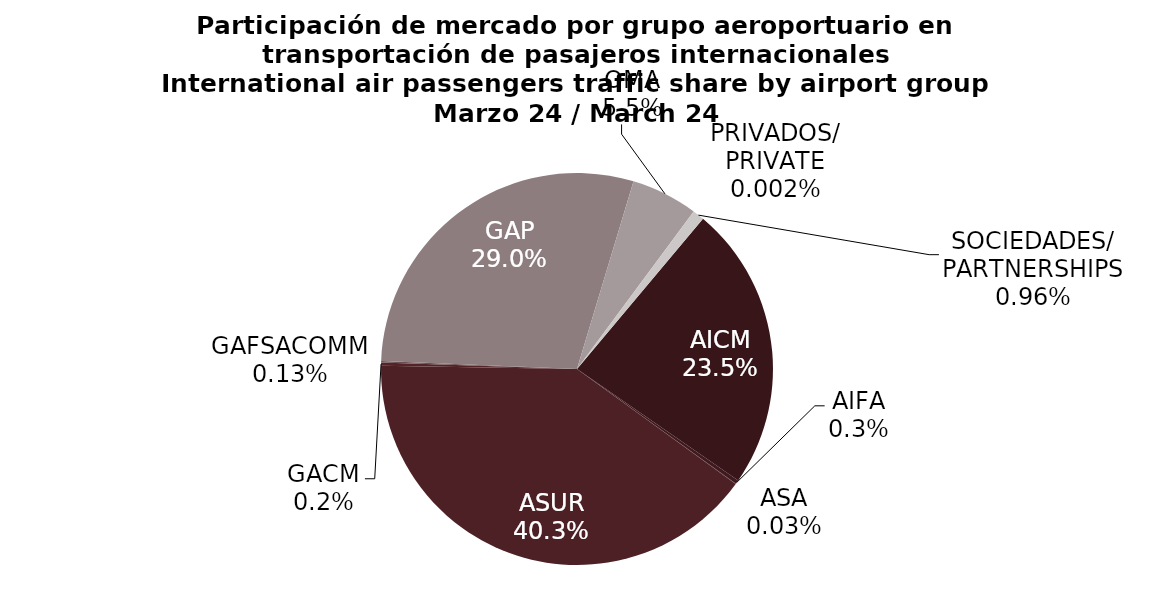
| Category | Series 0 |
|---|---|
| AICM | 1437.728 |
| AIFA | 19.698 |
| ASA | 1.939 |
| ASUR | 2463.102 |
| GACM | 15.515 |
| GAFSACOMM | 8.099 |
| GAP | 1772.95 |
| OMA | 335.644 |
| PRIVADOS/
PRIVATE | 0.145 |
| SOCIEDADES/
PARTNERSHIPS | 58.695 |